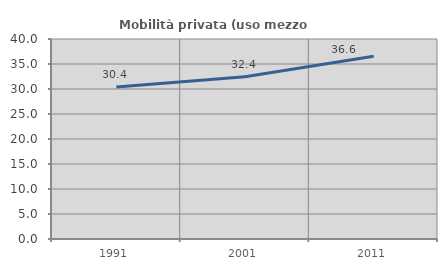
| Category | Mobilità privata (uso mezzo privato) |
|---|---|
| 1991.0 | 30.38 |
| 2001.0 | 32.432 |
| 2011.0 | 36.559 |